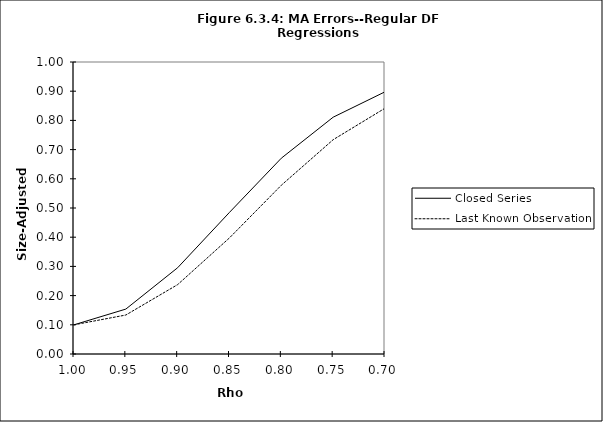
| Category | Closed Series | Last Known Observation |
|---|---|---|
| 1.0 | 0.1 | 0.1 |
| 0.95 | 0.154 | 0.134 |
| 0.9 | 0.296 | 0.238 |
| 0.85 | 0.485 | 0.398 |
| 0.8 | 0.671 | 0.578 |
| 0.75 | 0.811 | 0.734 |
| 0.7 | 0.898 | 0.842 |